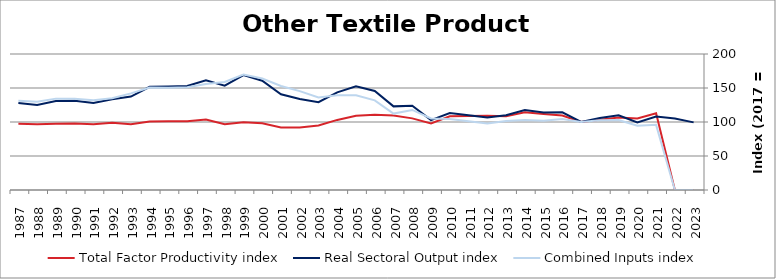
| Category | Total Factor Productivity index | Real Sectoral Output index | Combined Inputs index |
|---|---|---|---|
| 2023.0 | 0 | 99.427 | 0 |
| 2022.0 | 0 | 105.104 | 0 |
| 2021.0 | 112.827 | 108.082 | 95.794 |
| 2020.0 | 105.15 | 99.305 | 94.441 |
| 2019.0 | 106.753 | 109.748 | 102.806 |
| 2018.0 | 103.252 | 105.75 | 102.419 |
| 2017.0 | 100 | 100 | 100 |
| 2016.0 | 109.451 | 114.212 | 104.35 |
| 2015.0 | 111.748 | 113.847 | 101.878 |
| 2014.0 | 114.466 | 117.743 | 102.863 |
| 2013.0 | 108.36 | 110.058 | 101.567 |
| 2012.0 | 109.141 | 106.551 | 97.627 |
| 2011.0 | 108.871 | 109.923 | 100.966 |
| 2010.0 | 108.279 | 113.117 | 104.469 |
| 2009.0 | 97.772 | 102.826 | 105.169 |
| 2008.0 | 105.349 | 124.032 | 117.734 |
| 2007.0 | 109.473 | 122.991 | 112.348 |
| 2006.0 | 110.489 | 145.726 | 131.892 |
| 2005.0 | 109.329 | 152.452 | 139.444 |
| 2004.0 | 103.065 | 143.524 | 139.255 |
| 2003.0 | 94.879 | 129.082 | 136.049 |
| 2002.0 | 92.089 | 133.903 | 145.406 |
| 2001.0 | 92.032 | 140.73 | 152.914 |
| 2000.0 | 98.01 | 160.755 | 164.019 |
| 1999.0 | 99.477 | 168.96 | 169.849 |
| 1998.0 | 96.61 | 153.4 | 158.783 |
| 1997.0 | 103.642 | 161.401 | 155.729 |
| 1996.0 | 101.249 | 152.861 | 150.975 |
| 1995.0 | 101.176 | 152.257 | 150.487 |
| 1994.0 | 100.647 | 151.757 | 150.782 |
| 1993.0 | 96.665 | 137.361 | 142.101 |
| 1992.0 | 98.949 | 133.571 | 134.99 |
| 1991.0 | 96.86 | 127.918 | 132.064 |
| 1990.0 | 97.826 | 131.351 | 134.27 |
| 1989.0 | 97.504 | 131.008 | 134.362 |
| 1988.0 | 96.541 | 125.19 | 129.676 |
| 1987.0 | 97.567 | 128.112 | 131.307 |